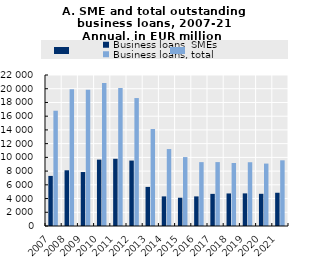
| Category | Business loans, SMEs | Business loans, total |
|---|---|---|
| 2007.0 | 7297 | 16796 |
| 2008.0 | 8117 | 19937 |
| 2009.0 | 7863 | 19863 |
| 2010.0 | 9671 | 20828 |
| 2011.0 | 9794 | 20090 |
| 2012.0 | 9534 | 18643 |
| 2013.0 | 5695 | 14135 |
| 2014.0 | 4314 | 11213 |
| 2015.0 | 4118 | 10040 |
| 2016.0 | 4313.607 | 9306.061 |
| 2017.0 | 4681.304 | 9310.801 |
| 2018.0 | 4741.257 | 9177.439 |
| 2019.0 | 4751.505 | 9289.735 |
| 2020.0 | 4691.869 | 9094.339 |
| 2021.0 | 4843.948 | 9571.556 |